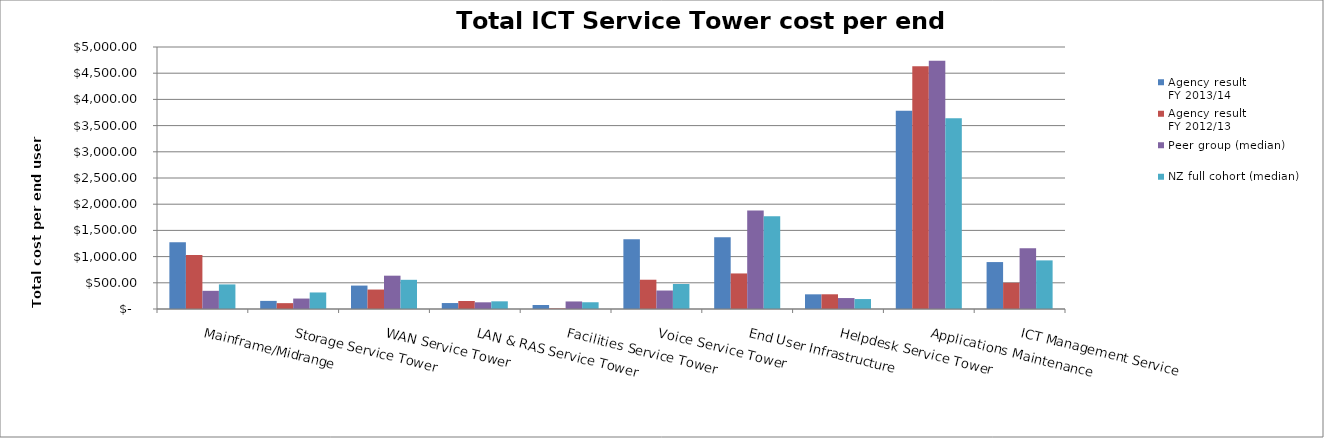
| Category | Agency result
FY 2013/14 | Agency result
FY 2012/13 | Peer group (median) | NZ full cohort (median) |
|---|---|---|---|---|
| Mainframe/Midrange | 1273.824 | 1029.966 | 346.948 | 469.179 |
| Storage Service Tower | 154.806 | 111.73 | 199.323 | 315.592 |
| WAN Service Tower | 446.941 | 371.147 | 635.77 | 557.006 |
| LAN & RAS Service Tower | 113.608 | 152.397 | 127.708 | 146.525 |
| Facilities Service Tower | 76.571 | 9.418 | 143.943 | 128.765 |
| Voice Service Tower | 1332.085 | 558.647 | 352.581 | 477.695 |
| End User Infrastructure | 1371.619 | 678.51 | 1879.24 | 1770.401 |
| Helpdesk Service Tower | 280.067 | 280.822 | 208.964 | 189.812 |
| Applications Maintenance | 3784.02 | 4634.418 | 4735.527 | 3639.154 |
| ICT Management Service | 895.547 | 500.856 | 1159.335 | 927.742 |